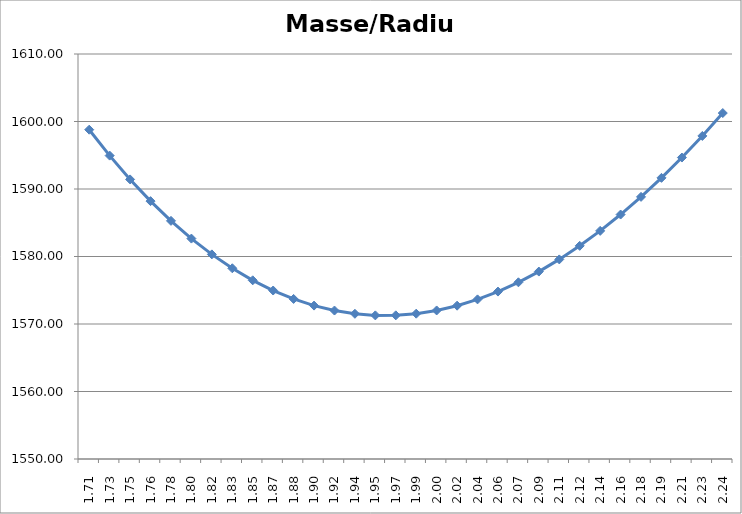
| Category | Masse/Radius |
|---|---|
| 1.7134800891101682 | 1598.785 |
| 1.73061489000127 | 1594.947 |
| 1.7477496908923715 | 1591.421 |
| 1.7648844917834732 | 1588.202 |
| 1.7820192926745748 | 1585.281 |
| 1.7991540935656765 | 1582.654 |
| 1.816288894456778 | 1580.315 |
| 1.8334236953478797 | 1578.256 |
| 1.8505584962389814 | 1576.473 |
| 1.867693297130083 | 1574.961 |
| 1.8848280980211847 | 1573.713 |
| 1.9019628989122863 | 1572.726 |
| 1.919097699803388 | 1571.994 |
| 1.9362325006944896 | 1571.513 |
| 1.9533673015855912 | 1571.278 |
| 1.9705021024766929 | 1571.284 |
| 1.9876369033677945 | 1571.529 |
| 2.0047717042588964 | 1572.006 |
| 2.0219065051499983 | 1572.714 |
| 2.0390413060411 | 1573.648 |
| 2.056176106932202 | 1574.803 |
| 2.073310907823304 | 1576.178 |
| 2.0904457087144057 | 1577.768 |
| 2.1075805096055076 | 1579.569 |
| 2.1247153104966094 | 1581.58 |
| 2.1418501113877113 | 1583.796 |
| 2.158984912278813 | 1586.216 |
| 2.176119713169915 | 1588.835 |
| 2.193254514061017 | 1591.65 |
| 2.2103893149521188 | 1594.661 |
| 2.2275241158432206 | 1597.863 |
| 2.2446589167343225 | 1601.254 |